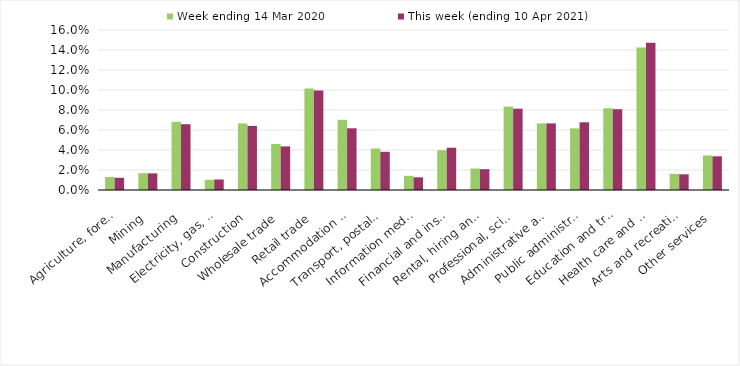
| Category | Week ending 14 Mar 2020 | This week (ending 10 Apr 2021) |
|---|---|---|
| Agriculture, forestry and fishing | 0.013 | 0.012 |
| Mining | 0.017 | 0.017 |
| Manufacturing | 0.068 | 0.066 |
| Electricity, gas, water and waste services | 0.01 | 0.01 |
| Construction | 0.067 | 0.064 |
| Wholesale trade | 0.046 | 0.044 |
| Retail trade | 0.102 | 0.1 |
| Accommodation and food services | 0.07 | 0.062 |
| Transport, postal and warehousing | 0.042 | 0.038 |
| Information media and telecommunications | 0.014 | 0.013 |
| Financial and insurance services | 0.04 | 0.042 |
| Rental, hiring and real estate services | 0.022 | 0.021 |
| Professional, scientific and technical services | 0.083 | 0.081 |
| Administrative and support services | 0.067 | 0.067 |
| Public administration and safety | 0.062 | 0.068 |
| Education and training | 0.082 | 0.081 |
| Health care and social assistance | 0.142 | 0.147 |
| Arts and recreation services | 0.016 | 0.016 |
| Other services | 0.034 | 0.034 |